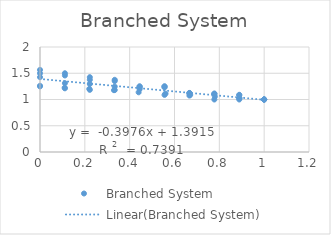
| Category | Branched System |
|---|---|
| 1.0 | 1 |
| 0.8888888888888888 | 1 |
| 0.7777777777777778 | 1 |
| 0.6666666666666666 | 1.125 |
| 0.5555555555555556 | 1.25 |
| 0.4444444444444444 | 1.25 |
| 0.3333333333333333 | 1.375 |
| 0.2222222222222222 | 1.375 |
| 0.1111111111111111 | 1.5 |
| 0.0 | 1.5 |
| 1.0 | 1 |
| 0.8888888888888888 | 1.082 |
| 0.7777777777777778 | 1.115 |
| 0.6666666666666666 | 1.115 |
| 0.5555555555555556 | 1.23 |
| 0.4444444444444444 | 1.23 |
| 0.3333333333333333 | 1.246 |
| 0.2222222222222222 | 1.295 |
| 0.1111111111111111 | 1.311 |
| 0.0 | 1.426 |
| 1.0 | 1 |
| 0.8888888888888888 | 1.022 |
| 0.7777777777777778 | 1.107 |
| 0.6666666666666666 | 1.075 |
| 0.5555555555555556 | 1.088 |
| 0.4444444444444444 | 1.197 |
| 0.3333333333333333 | 1.181 |
| 0.2222222222222222 | 1.184 |
| 0.1111111111111111 | 1.213 |
| 0.0 | 1.261 |
| 1.0 | 1 |
| 0.8888888888888888 | 1.089 |
| 0.7777777777777778 | 1.105 |
| 0.6666666666666666 | 1.123 |
| 0.5555555555555556 | 1.249 |
| 0.4444444444444444 | 1.247 |
| 0.3333333333333333 | 1.351 |
| 0.2222222222222222 | 1.425 |
| 0.1111111111111111 | 1.458 |
| 0.0 | 1.564 |
| 1.0 | 1 |
| 0.89 | 1.024 |
| 0.78 | 1.056 |
| 0.67 | 1.089 |
| 0.56 | 1.113 |
| 0.44 | 1.137 |
| 0.33 | 1.177 |
| 0.22 | 1.202 |
| 0.11 | 1.226 |
| 0.0 | 1.25 |